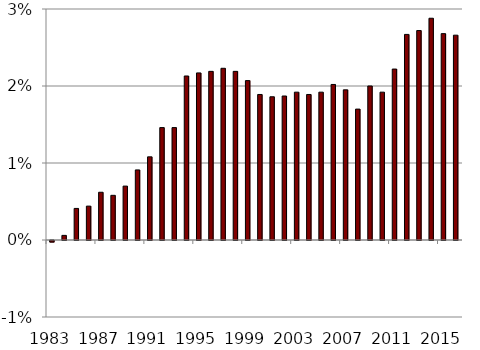
| Category | Deficit |
|---|---|
| 1983.0 | 0 |
| 1984.0 | 0.001 |
| 1985.0 | 0.004 |
| 1986.0 | 0.004 |
| 1987.0 | 0.006 |
| 1988.0 | 0.006 |
| 1989.0 | 0.007 |
| 1990.0 | 0.009 |
| 1991.0 | 0.011 |
| 1992.0 | 0.015 |
| 1993.0 | 0.015 |
| 1994.0 | 0.021 |
| 1995.0 | 0.022 |
| 1996.0 | 0.022 |
| 1997.0 | 0.022 |
| 1998.0 | 0.022 |
| 1999.0 | 0.021 |
| 2000.0 | 0.019 |
| 2001.0 | 0.019 |
| 2002.0 | 0.019 |
| 2003.0 | 0.019 |
| 2004.0 | 0.019 |
| 2005.0 | 0.019 |
| 2006.0 | 0.02 |
| 2007.0 | 0.02 |
| 2008.0 | 0.017 |
| 2009.0 | 0.02 |
| 2010.0 | 0.019 |
| 2011.0 | 0.022 |
| 2012.0 | 0.027 |
| 2013.0 | 0.027 |
| 2014.0 | 0.029 |
| 2015.0 | 0.027 |
| 2016.0 | 0.027 |